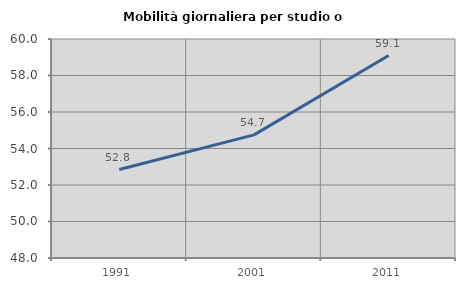
| Category | Mobilità giornaliera per studio o lavoro |
|---|---|
| 1991.0 | 52.847 |
| 2001.0 | 54.746 |
| 2011.0 | 59.095 |